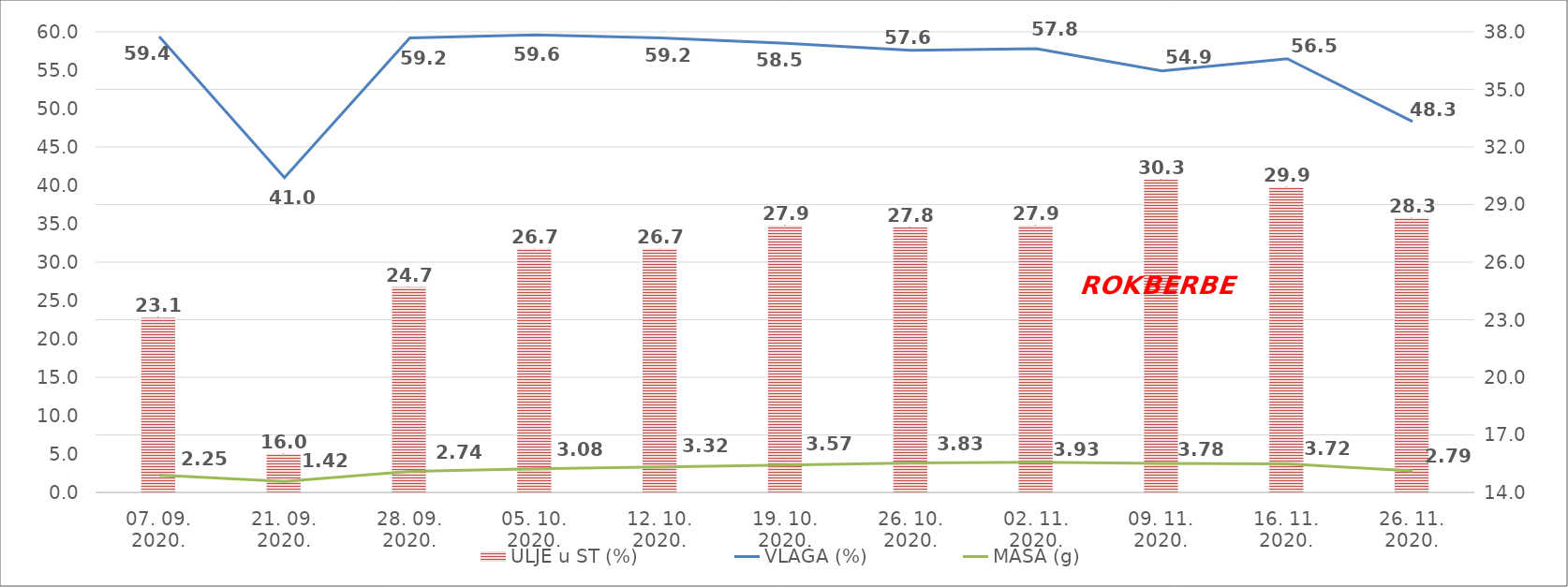
| Category | ULJE u ST (%) |
|---|---|
| 07. 09. 2020. | 23.1 |
| 21. 09. 2020. | 16 |
| 28. 09. 2020. | 24.7 |
| 05. 10. 2020. | 26.7 |
| 12. 10. 2020. | 26.7 |
| 19. 10. 2020. | 27.9 |
| 26. 10. 2020. | 27.8 |
| 02. 11. 2020. | 27.9 |
| 09. 11. 2020. | 30.3 |
| 16. 11. 2020. | 29.9 |
| 26. 11. 2020. | 28.3 |